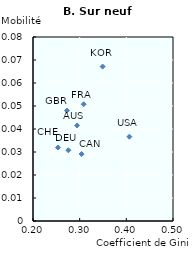
| Category | Series 0 |
|---|---|
| 0.25344 | 0.032 |
| 0.275783333333333 | 0.031 |
| 0.294476666666667 | 0.042 |
| 0.30856 | 0.051 |
| 0.34921 | 0.067 |
| 0.406499444444444 | 0.037 |
| 0.2727 | 0.048 |
| 0.3041 | 0.029 |